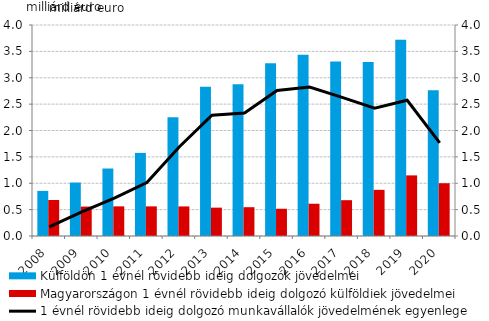
| Category | Külföldön 1 évnél rövidebb ideig dolgozók jövedelmei | Magyarországon 1 évnél rövidebb ideig dolgozó külföldiek jövedelmei |
|---|---|---|
| 2008.0 | 0.855 | 0.682 |
| 2009.0 | 1.013 | 0.558 |
| 2010.0 | 1.28 | 0.562 |
| 2011.0 | 1.576 | 0.562 |
| 2012.0 | 2.254 | 0.561 |
| 2013.0 | 2.828 | 0.538 |
| 2014.0 | 2.878 | 0.546 |
| 2015.0 | 3.275 | 0.517 |
| 2016.0 | 3.435 | 0.612 |
| 2017.0 | 3.306 | 0.679 |
| 2018.0 | 3.297 | 0.875 |
| 2019.0 | 3.721 | 1.149 |
| 2020.0 | 2.765 | 1 |